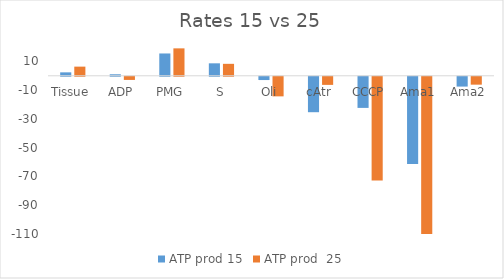
| Category | ATP prod 15 | ATP prod  25 |
|---|---|---|
| Tissue | 2.38 | 6.352 |
| ADP | 1.034 | -2.198 |
| PMG | 15.504 | 19.056 |
| S | 8.656 | 8.3 |
| Oli | -2.277 | -13.617 |
| cAtr | -24.634 | -5.641 |
| CCCP | -21.641 | -72.086 |
| Ama1 | -60.687 | -122.446 |
| Ama2 | -6.823 | -5.487 |